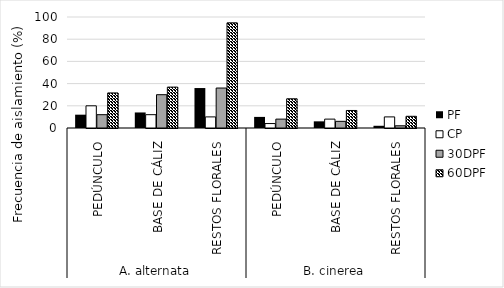
| Category | PF | CP | 30DPF | 60DPF |
|---|---|---|---|---|
| 0 | 12 | 20 | 12 | 31.58 |
| 1 | 14 | 12 | 30 | 36.84 |
| 2 | 36 | 10 | 36 | 94.74 |
| 3 | 10 | 4 | 8 | 26.32 |
| 4 | 6 | 8 | 6 | 15.79 |
| 5 | 2 | 10 | 2 | 10.53 |